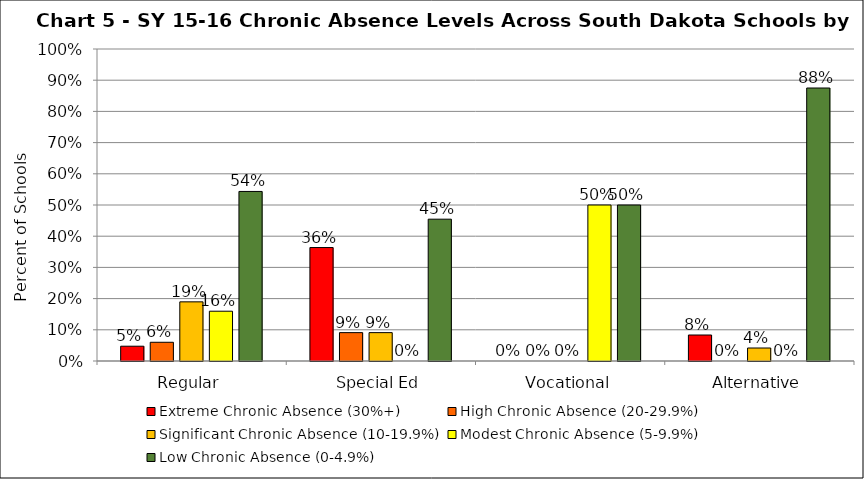
| Category | Extreme Chronic Absence (30%+) | High Chronic Absence (20-29.9%) | Significant Chronic Absence (10-19.9%) | Modest Chronic Absence (5-9.9%) | Low Chronic Absence (0-4.9%) |
|---|---|---|---|---|---|
| 0 | 0.047 | 0.06 | 0.19 | 0.16 | 0.543 |
| 1 | 0.364 | 0.091 | 0.091 | 0 | 0.455 |
| 2 | 0 | 0 | 0 | 0.5 | 0.5 |
| 3 | 0.083 | 0 | 0.042 | 0 | 0.875 |